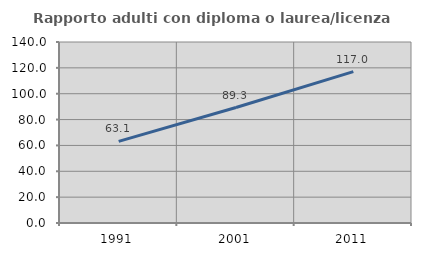
| Category | Rapporto adulti con diploma o laurea/licenza media  |
|---|---|
| 1991.0 | 63.147 |
| 2001.0 | 89.298 |
| 2011.0 | 117.038 |